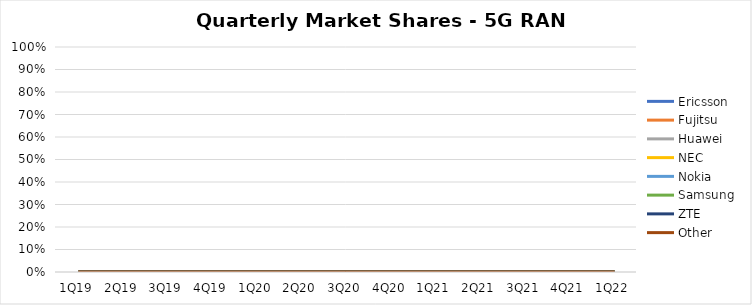
| Category | Ericsson | Fujitsu | Huawei | NEC | Nokia | Samsung | ZTE | Other |
|---|---|---|---|---|---|---|---|---|
| 1Q19 | 0 | 0 | 0 | 0 | 0 | 0 | 0 | 0 |
| 2Q19 | 0 | 0 | 0 | 0 | 0 | 0 | 0 | 0 |
| 3Q19 | 0 | 0 | 0 | 0 | 0 | 0 | 0 | 0 |
| 4Q19 | 0 | 0 | 0 | 0 | 0 | 0 | 0 | 0 |
| 1Q20 | 0 | 0 | 0 | 0 | 0 | 0 | 0 | 0 |
| 2Q20 | 0 | 0 | 0 | 0 | 0 | 0 | 0 | 0 |
| 3Q20 | 0 | 0 | 0 | 0 | 0 | 0 | 0 | 0 |
| 4Q20 | 0 | 0 | 0 | 0 | 0 | 0 | 0 | 0 |
| 1Q21 | 0 | 0 | 0 | 0 | 0 | 0 | 0 | 0 |
| 2Q21 | 0 | 0 | 0 | 0 | 0 | 0 | 0 | 0 |
| 3Q21 | 0 | 0 | 0 | 0 | 0 | 0 | 0 | 0 |
| 4Q21 | 0 | 0 | 0 | 0 | 0 | 0 | 0 | 0 |
| 1Q22 | 0 | 0 | 0 | 0 | 0 | 0 | 0 | 0 |